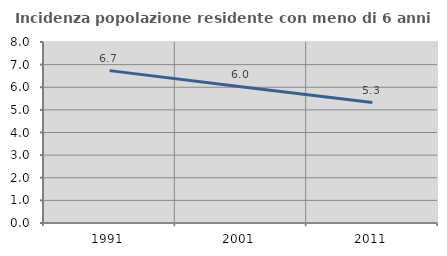
| Category | Incidenza popolazione residente con meno di 6 anni |
|---|---|
| 1991.0 | 6.735 |
| 2001.0 | 6.027 |
| 2011.0 | 5.322 |